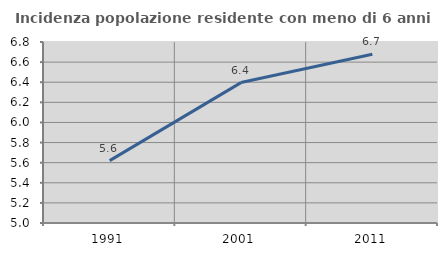
| Category | Incidenza popolazione residente con meno di 6 anni |
|---|---|
| 1991.0 | 5.62 |
| 2001.0 | 6.396 |
| 2011.0 | 6.677 |